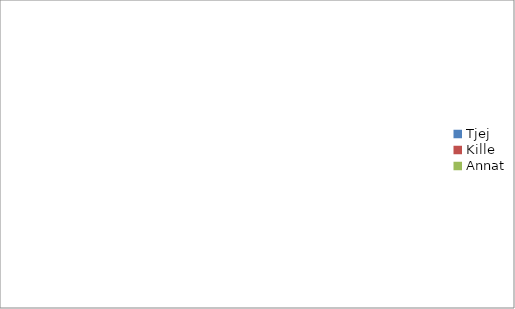
| Category | Series 0 |
|---|---|
| Tjej | 0 |
| Kille | 0 |
| Annat | 0 |